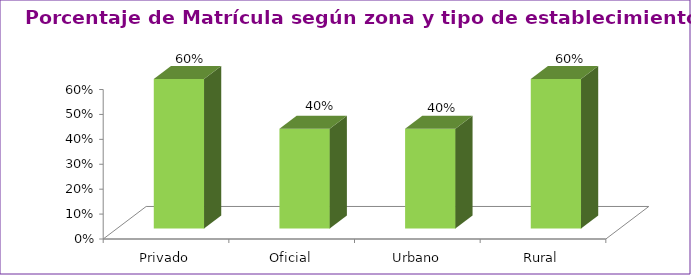
| Category | Series 1 |
|---|---|
| Privado | 0.6 |
| Oficial | 0.4 |
| Urbano | 0.4 |
| Rural | 0.6 |